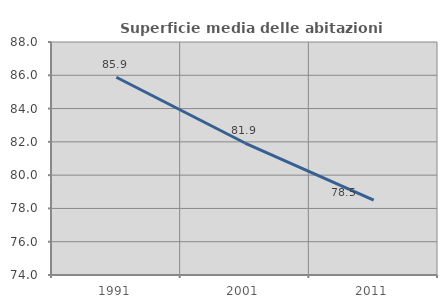
| Category | Superficie media delle abitazioni occupate |
|---|---|
| 1991.0 | 85.884 |
| 2001.0 | 81.93 |
| 2011.0 | 78.495 |